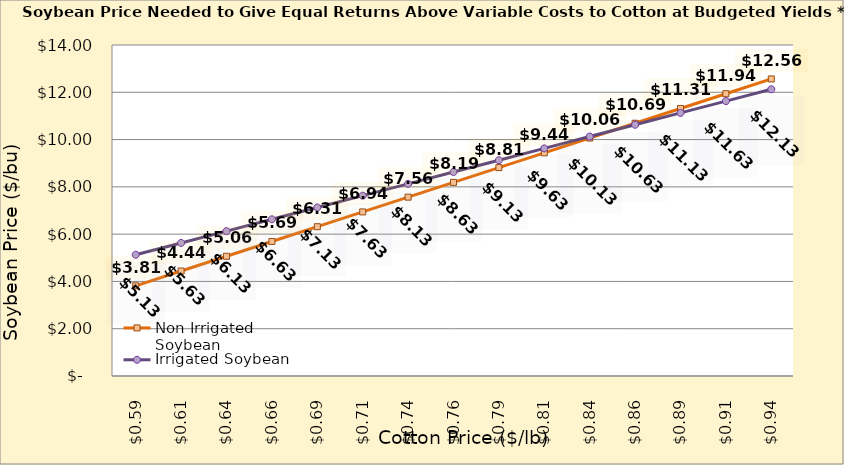
| Category | Non Irrigated Soybean | Irrigated Soybean |
|---|---|---|
| 0.5849999999999999 | 3.815 | 5.127 |
| 0.6099999999999999 | 4.44 | 5.627 |
| 0.6349999999999999 | 5.065 | 6.127 |
| 0.6599999999999999 | 5.69 | 6.627 |
| 0.6849999999999999 | 6.315 | 7.127 |
| 0.71 | 6.94 | 7.627 |
| 0.735 | 7.565 | 8.127 |
| 0.76 | 8.19 | 8.627 |
| 0.785 | 8.815 | 9.127 |
| 0.81 | 9.44 | 9.627 |
| 0.8350000000000001 | 10.065 | 10.127 |
| 0.8600000000000001 | 10.69 | 10.627 |
| 0.8850000000000001 | 11.315 | 11.127 |
| 0.9100000000000001 | 11.94 | 11.627 |
| 0.9350000000000002 | 12.565 | 12.127 |